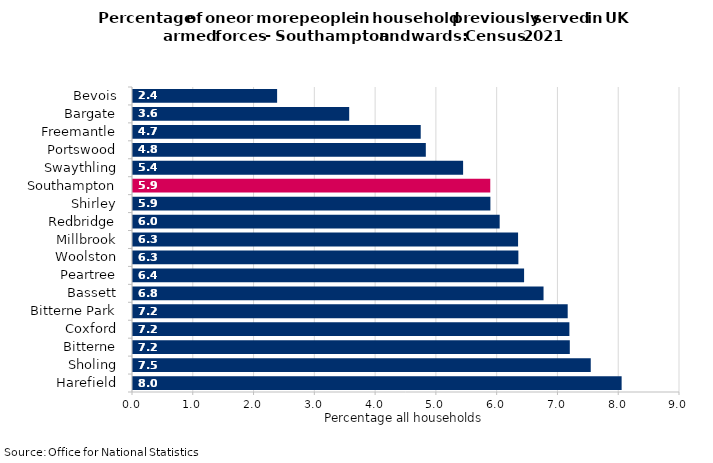
| Category | 1 or more people in the household previously served in UK armed forces |
|---|---|
| Harefield | 8.04 |
| Sholing | 7.532 |
| Bitterne | 7.187 |
| Coxford | 7.18 |
| Bitterne Park | 7.152 |
| Bassett | 6.755 |
| Peartree | 6.435 |
| Woolston | 6.341 |
| Millbrook | 6.336 |
| Redbridge | 6.033 |
| Shirley | 5.88 |
| Southampton | 5.878 |
| Swaythling | 5.431 |
| Portswood | 4.818 |
| Freemantle | 4.734 |
| Bargate | 3.557 |
| Bevois | 2.371 |